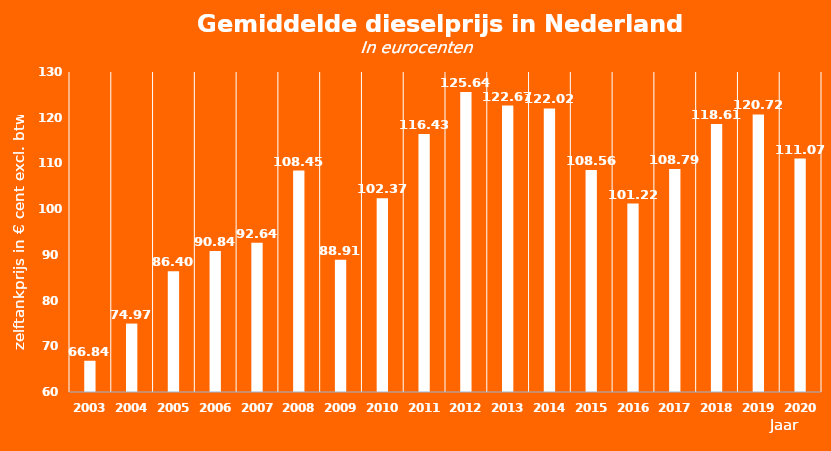
| Category | 2003 |
|---|---|
| 2003.0 | 66.835 |
| 2004.0 | 74.968 |
| 2005.0 | 86.396 |
| 2006.0 | 90.837 |
| 2007.0 | 92.645 |
| 2008.0 | 108.446 |
| 2009.0 | 88.912 |
| 2010.0 | 102.373 |
| 2011.0 | 116.434 |
| 2012.0 | 125.64 |
| 2013.0 | 122.67 |
| 2014.0 | 122.019 |
| 2015.0 | 108.56 |
| 2016.0 | 101.22 |
| 2017.0 | 108.79 |
| 2018.0 | 118.61 |
| 2019.0 | 120.72 |
| 2020.0 | 111.074 |